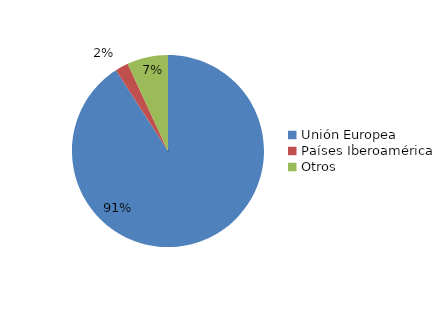
| Category | Series 0 |
|---|---|
| Unión Europea | 7039 |
| Países Iberoamérica | 173 |
| Otros | 534 |